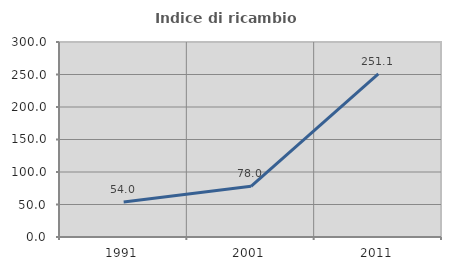
| Category | Indice di ricambio occupazionale  |
|---|---|
| 1991.0 | 53.962 |
| 2001.0 | 78.025 |
| 2011.0 | 251.073 |